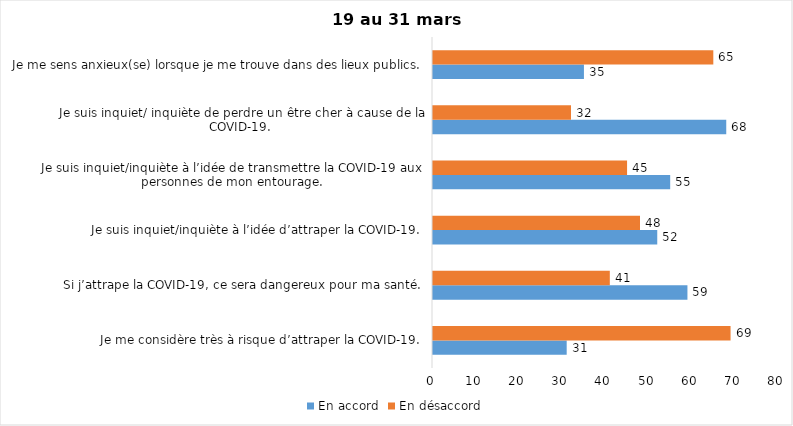
| Category | En accord | En désaccord |
|---|---|---|
| Je me considère très à risque d’attraper la COVID-19. | 31 | 69 |
| Si j’attrape la COVID-19, ce sera dangereux pour ma santé. | 59 | 41 |
| Je suis inquiet/inquiète à l’idée d’attraper la COVID-19. | 52 | 48 |
| Je suis inquiet/inquiète à l’idée de transmettre la COVID-19 aux personnes de mon entourage. | 55 | 45 |
| Je suis inquiet/ inquiète de perdre un être cher à cause de la COVID-19. | 68 | 32 |
| Je me sens anxieux(se) lorsque je me trouve dans des lieux publics. | 35 | 65 |